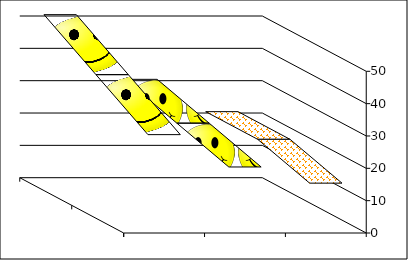
| Category | Series 1 | Series 2 | Series 3 |
|---|---|---|---|
| Point 1 | 50 | 30 | 20 |
| Point 2 | 40 | 25 | 20 |
| Point 3 | 30 | 20 | 15 |